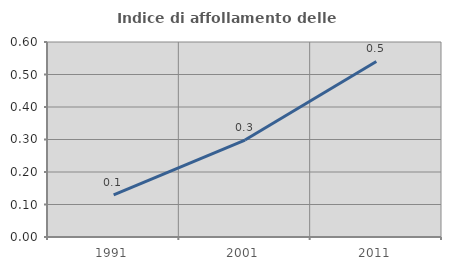
| Category | Indice di affollamento delle abitazioni  |
|---|---|
| 1991.0 | 0.13 |
| 2001.0 | 0.298 |
| 2011.0 | 0.54 |